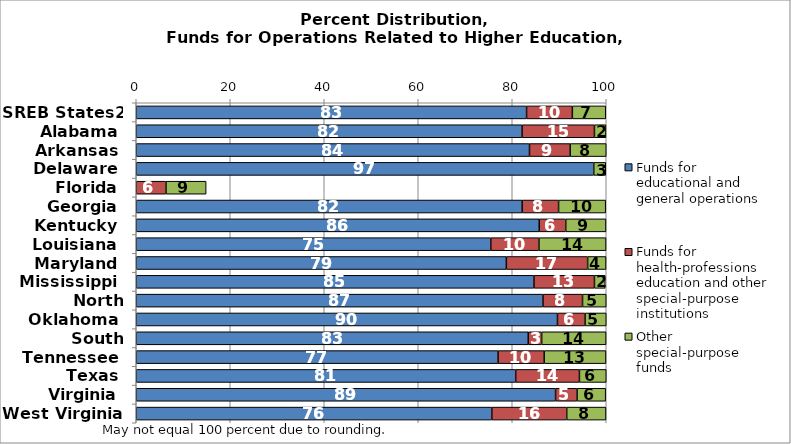
| Category | Funds for educational and general operations | Funds for health-professions education and other special-purpose institutions | Other special-purpose funds |
|---|---|---|---|
| SREB States2 | 83.046 | 9.74 | 7.101 |
| Alabama | 82.086 | 15.404 | 2.446 |
| Arkansas | 83.668 | 8.653 | 8.259 |
| Delaware | 97.343 | 0 | 2.551 |
| Florida | 0 | 6.328 | 8.541 |
| Georgia | 82.107 | 7.752 | 10.027 |
| Kentucky | 85.745 | 5.641 | 8.552 |
| Louisiana | 75.437 | 10.239 | 14.278 |
| Maryland | 78.744 | 17.301 | 3.909 |
| Mississippi | 84.624 | 12.863 | 2.293 |
| North Carolina | 86.537 | 8.42 | 5.04 |
| Oklahoma | 89.623 | 5.876 | 4.502 |
| South Carolina | 83.405 | 2.856 | 13.705 |
| Tennessee | 76.985 | 9.81 | 13.145 |
| Texas | 80.739 | 13.558 | 5.703 |
| Virginia | 89.221 | 4.571 | 6.086 |
| West Virginia | 75.654 | 15.941 | 8.347 |